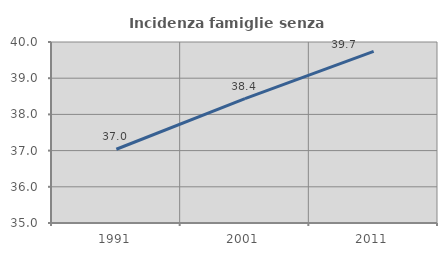
| Category | Incidenza famiglie senza nuclei |
|---|---|
| 1991.0 | 37.037 |
| 2001.0 | 38.434 |
| 2011.0 | 39.739 |